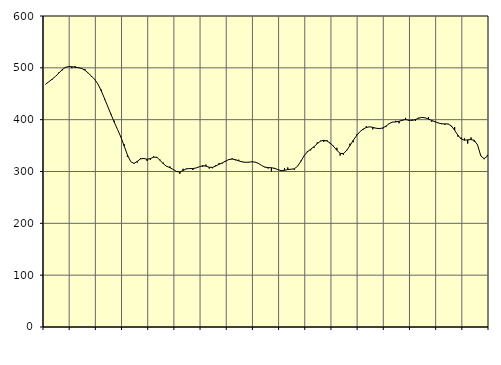
| Category | Piggar | Series 1 |
|---|---|---|
| nan | 468.3 | 468.64 |
| 87.0 | 473.2 | 473.27 |
| 87.0 | 477.1 | 478.19 |
| 87.0 | 483.4 | 483.36 |
| nan | 490.8 | 489.68 |
| 88.0 | 494.7 | 496.19 |
| 88.0 | 501.2 | 500.78 |
| 88.0 | 502.7 | 502.53 |
| nan | 499.3 | 502.12 |
| 89.0 | 503.5 | 501.16 |
| 89.0 | 499.8 | 500.27 |
| 89.0 | 499.3 | 498.77 |
| nan | 497.6 | 495.47 |
| 90.0 | 489.7 | 490.11 |
| 90.0 | 482.4 | 484.08 |
| 90.0 | 477.3 | 477.71 |
| nan | 468.5 | 468.56 |
| 91.0 | 458 | 455.62 |
| 91.0 | 438.8 | 440.61 |
| 91.0 | 425.5 | 425.21 |
| nan | 411 | 409.83 |
| 92.0 | 397.8 | 394.76 |
| 92.0 | 380.7 | 380.79 |
| 92.0 | 367.4 | 366.3 |
| nan | 352.6 | 349.25 |
| 93.0 | 328.4 | 331.86 |
| 93.0 | 319 | 319.08 |
| 93.0 | 314.9 | 315.53 |
| nan | 317.2 | 319.54 |
| 94.0 | 326.1 | 324.34 |
| 94.0 | 326.1 | 325.11 |
| 94.0 | 320.3 | 323.64 |
| nan | 322.6 | 324.79 |
| 95.0 | 329.4 | 327.69 |
| 95.0 | 328.2 | 327.28 |
| 95.0 | 322.7 | 321.52 |
| nan | 317.1 | 314.54 |
| 96.0 | 309.4 | 310.06 |
| 96.0 | 309.7 | 307.35 |
| 96.0 | 304.1 | 303.87 |
| nan | 300.6 | 299.99 |
| 97.0 | 295.4 | 299.1 |
| 97.0 | 305.3 | 301.93 |
| 97.0 | 305.7 | 304.98 |
| nan | 306.2 | 305.72 |
| 98.0 | 302.9 | 305.65 |
| 98.0 | 307 | 306.85 |
| 98.0 | 309.4 | 309.2 |
| nan | 309 | 311.21 |
| 99.0 | 313.3 | 310.31 |
| 99.0 | 305.6 | 308.15 |
| 99.0 | 306.2 | 307.92 |
| nan | 312.2 | 310.54 |
| 0.0 | 316.4 | 313.99 |
| 0.0 | 315.7 | 316.63 |
| 0.0 | 318.9 | 320.03 |
| nan | 323.8 | 323.02 |
| 1.0 | 325.5 | 323.99 |
| 1.0 | 321.6 | 322.84 |
| 1.0 | 322.8 | 320.55 |
| nan | 319.3 | 318.61 |
| 2.0 | 318.2 | 317.76 |
| 2.0 | 317.4 | 317.99 |
| 2.0 | 319.2 | 318.65 |
| nan | 318.4 | 318.16 |
| 3.0 | 315 | 315.73 |
| 3.0 | 311.8 | 311.75 |
| 3.0 | 308 | 308.57 |
| nan | 305.7 | 307.58 |
| 4.0 | 300.3 | 307.25 |
| 4.0 | 304.8 | 306.07 |
| 4.0 | 303.2 | 303.57 |
| nan | 302.6 | 301.65 |
| 5.0 | 306.5 | 302.21 |
| 5.0 | 307.8 | 303.84 |
| 5.0 | 304.4 | 304.35 |
| nan | 303.3 | 305.25 |
| 6.0 | 309.8 | 310.14 |
| 6.0 | 320.8 | 319.67 |
| 6.0 | 330.7 | 330.3 |
| nan | 339.5 | 337.97 |
| 7.0 | 340.7 | 342.98 |
| 7.0 | 345.6 | 347.82 |
| 7.0 | 356.2 | 353.62 |
| nan | 359.4 | 358.57 |
| 8.0 | 356.9 | 360.25 |
| 8.0 | 360.4 | 358.8 |
| 8.0 | 353 | 354.66 |
| nan | 349.6 | 348.44 |
| 9.0 | 345.7 | 340.89 |
| 9.0 | 330.8 | 334.98 |
| 9.0 | 332.3 | 334.72 |
| nan | 339.6 | 340.75 |
| 10.0 | 353.7 | 350.02 |
| 10.0 | 356.6 | 359.98 |
| 10.0 | 371.2 | 368.96 |
| nan | 376.6 | 376.46 |
| 11.0 | 380 | 381.64 |
| 11.0 | 387.4 | 384.91 |
| 11.0 | 385.9 | 386.21 |
| nan | 381.3 | 385.11 |
| 12.0 | 383 | 383.48 |
| 12.0 | 383.7 | 382.77 |
| 12.0 | 382.6 | 383.99 |
| nan | 385.7 | 387.49 |
| 13.0 | 393.1 | 392.34 |
| 13.0 | 395.6 | 395.27 |
| 13.0 | 397.8 | 395.64 |
| nan | 393 | 396.82 |
| 14.0 | 397.9 | 399.08 |
| 14.0 | 403.5 | 400.07 |
| 14.0 | 397.4 | 399 |
| nan | 400.2 | 398.5 |
| 15.0 | 397.5 | 400.35 |
| 15.0 | 403.8 | 402.82 |
| 15.0 | 403.8 | 404.23 |
| nan | 403.4 | 403.54 |
| 16.0 | 404.8 | 401.13 |
| 16.0 | 396 | 398.5 |
| 16.0 | 395.6 | 396.01 |
| nan | 393.3 | 393.67 |
| 17.0 | 391.4 | 392.17 |
| 17.0 | 390.1 | 391.88 |
| 17.0 | 392 | 391.61 |
| nan | 386.8 | 387.94 |
| 18.0 | 385.8 | 379.58 |
| 18.0 | 367.2 | 369.9 |
| 18.0 | 365.6 | 362.78 |
| nan | 364 | 360.37 |
| 19.0 | 353.9 | 361.09 |
| 19.0 | 365.7 | 361.63 |
| 19.0 | 357.4 | 360.21 |
| nan | 351.1 | 351.32 |
| 20.0 | 330.6 | 330.04 |
| 20.0 | 323.7 | 324.72 |
| 20.0 | 331.9 | 329.62 |